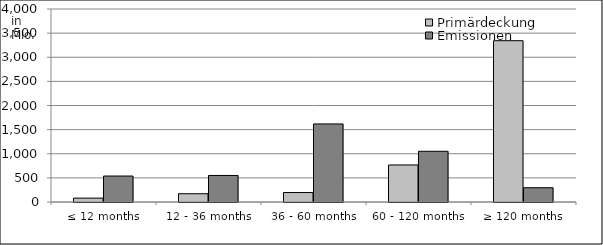
| Category | Primärdeckung | Emissionen |
|---|---|---|
| ≤ 12 months | 80469630.455 | 538000000 |
| 12 - 36 months | 171445511.605 | 550150000 |
| 36 - 60 months | 195949181.79 | 1618000000 |
| 60 - 120 months | 767639877.2 | 1051000000 |
| ≥ 120 months | 3343168018.48 | 295673602.88 |